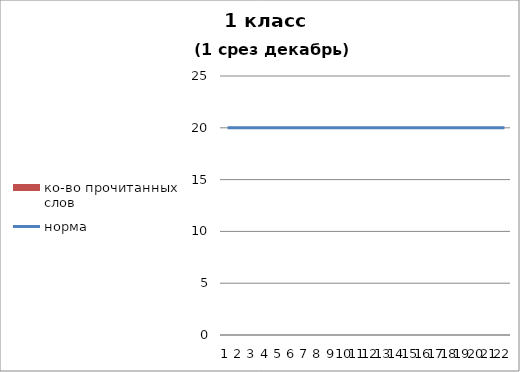
| Category | ко-во прочитанных слов |
|---|---|
| 0 | 0 |
| 1 | 0 |
| 2 | 0 |
| 3 | 0 |
| 4 | 0 |
| 5 | 0 |
| 6 | 0 |
| 7 | 0 |
| 8 | 0 |
| 9 | 0 |
| 10 | 0 |
| 11 | 0 |
| 12 | 0 |
| 13 | 0 |
| 14 | 0 |
| 15 | 0 |
| 16 | 0 |
| 17 | 0 |
| 18 | 0 |
| 19 | 0 |
| 20 | 0 |
| 21 | 0 |